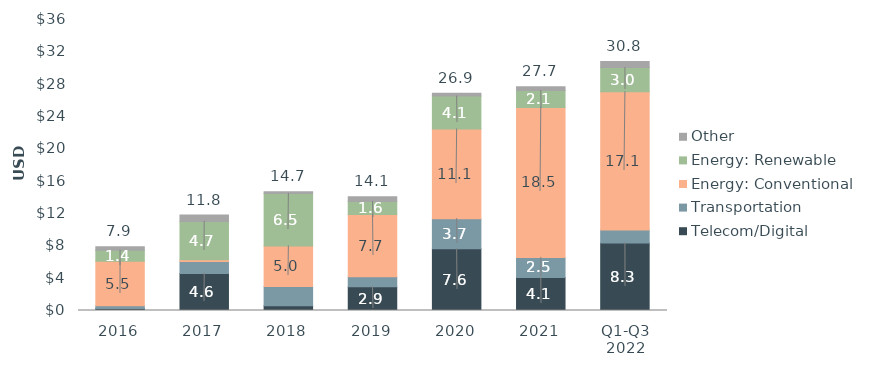
| Category | Telecom/Digital | Transportation | Energy: Conventional | Energy: Renewable | Other |
|---|---|---|---|---|---|
| 2016 | 0.248 | 0.346 | 5.492 | 1.365 | 0.422 |
| 2017 | 4.585 | 1.467 | 0.24 | 4.733 | 0.78 |
| 2018 | 0.579 | 2.404 | 5.011 | 6.486 | 0.216 |
| 2019 | 2.941 | 1.235 | 7.713 | 1.602 | 0.585 |
| 2020 | 7.638 | 3.722 | 11.093 | 4.071 | 0.353 |
| 2021 | 4.076 | 2.494 | 18.544 | 2.103 | 0.471 |
| Q1-Q3 2022 | 8.347 | 1.608 | 17.12 | 2.973 | 0.77 |